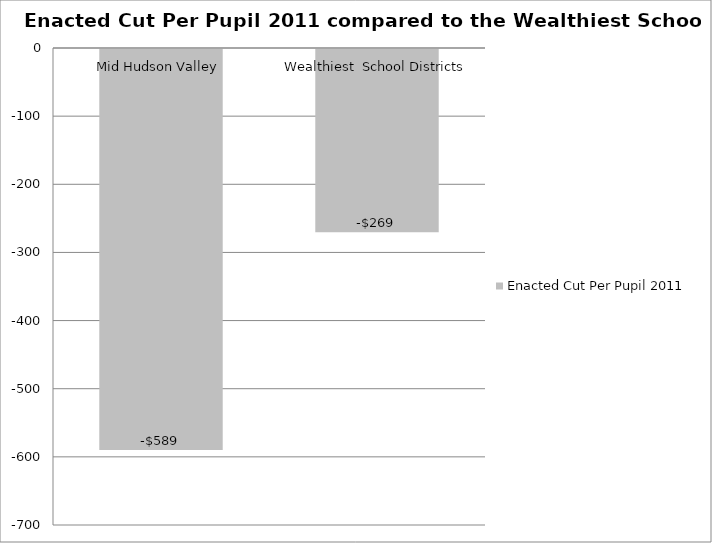
| Category | Enacted Cut Per Pupil 2011  |
|---|---|
| Mid Hudson Valley  | -588.338 |
| Wealthiest  School Districts | -268.999 |